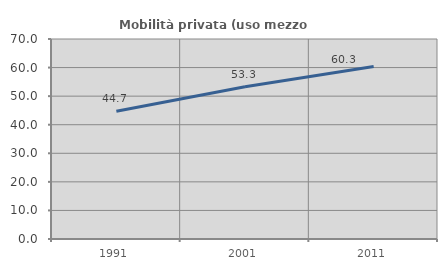
| Category | Mobilità privata (uso mezzo privato) |
|---|---|
| 1991.0 | 44.707 |
| 2001.0 | 53.305 |
| 2011.0 | 60.346 |